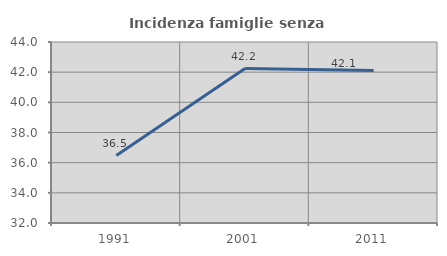
| Category | Incidenza famiglie senza nuclei |
|---|---|
| 1991.0 | 36.475 |
| 2001.0 | 42.241 |
| 2011.0 | 42.105 |